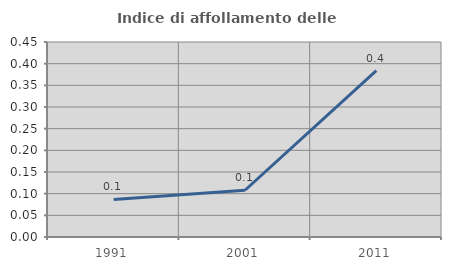
| Category | Indice di affollamento delle abitazioni  |
|---|---|
| 1991.0 | 0.087 |
| 2001.0 | 0.108 |
| 2011.0 | 0.384 |